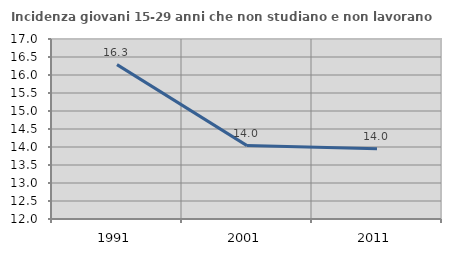
| Category | Incidenza giovani 15-29 anni che non studiano e non lavorano  |
|---|---|
| 1991.0 | 16.289 |
| 2001.0 | 14.038 |
| 2011.0 | 13.953 |